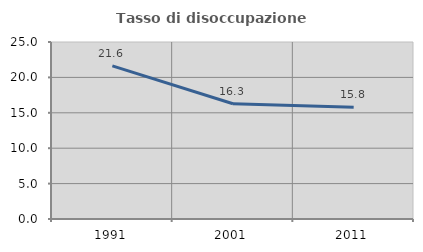
| Category | Tasso di disoccupazione giovanile  |
|---|---|
| 1991.0 | 21.622 |
| 2001.0 | 16.279 |
| 2011.0 | 15.789 |